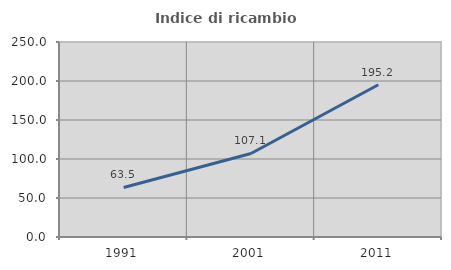
| Category | Indice di ricambio occupazionale  |
|---|---|
| 1991.0 | 63.492 |
| 2001.0 | 107.087 |
| 2011.0 | 195.161 |